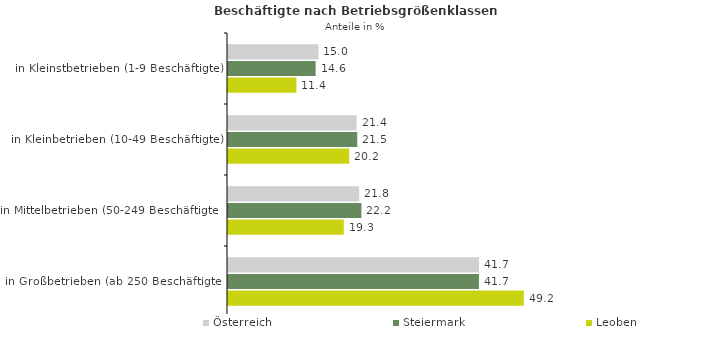
| Category | Österreich | Steiermark | Leoben |
|---|---|---|---|
| in Kleinstbetrieben (1-9 Beschäftigte) | 15.046 | 14.574 | 11.383 |
| in Kleinbetrieben (10-49 Beschäftigte) | 21.375 | 21.498 | 20.155 |
| in Mittelbetrieben (50-249 Beschäftigte) | 21.831 | 22.187 | 19.258 |
| in Großbetrieben (ab 250 Beschäftigte) | 41.748 | 41.742 | 49.204 |